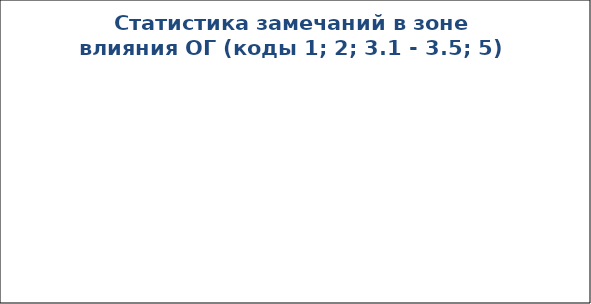
| Category | Series 0 |
|---|---|
|  "Снято"  | 0 |
| "Не снято" | 0 |
|  "Устранено"  | 0 |
|  "Не устранено" | 0 |
| "Рекомендации к улучшению"  | 0 |